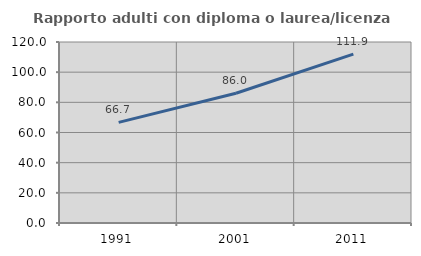
| Category | Rapporto adulti con diploma o laurea/licenza media  |
|---|---|
| 1991.0 | 66.725 |
| 2001.0 | 86.049 |
| 2011.0 | 111.912 |